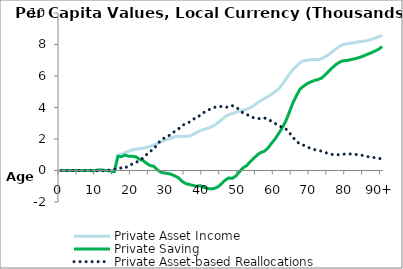
| Category | Private Asset Income | Private Saving | Private Asset-based Reallocations |
|---|---|---|---|
| 0 | 0 | -0.466 | 0.466 |
|  | 0 | -0.974 | 0.974 |
| 2 | 0 | -0.52 | 0.52 |
| 3 | 0 | -0.168 | 0.168 |
| 4 | 0 | 4.729 | -4.729 |
| 5 | 0 | -1.603 | 1.603 |
| 6 | 0 | -0.76 | 0.76 |
| 7 | 0 | -2.075 | 2.075 |
| 8 | 0 | -1.927 | 1.927 |
| 9 | 0 | -16.487 | 16.487 |
| 10 | 0 | 12.992 | -12.992 |
| 11 | 0 | 41.404 | -41.404 |
| 12 | 0 | 15.329 | -15.329 |
| 13 | 0 | -6.739 | 6.739 |
| 14 | 0 | -42.034 | 42.034 |
| 15 | 0 | -68.964 | 68.964 |
| 16 | 988.779 | 890.423 | 98.355 |
| 17 | 1050.04 | 875.482 | 174.558 |
| 18 | 1132.668 | 980.996 | 151.672 |
| 19 | 1223.722 | 902.758 | 320.963 |
| 20 | 1301.704 | 899.774 | 401.93 |
| 21 | 1354.694 | 869.34 | 485.354 |
| 22 | 1387.994 | 725.218 | 662.776 |
| 23 | 1418.592 | 637.777 | 780.815 |
| 24 | 1464.401 | 460.127 | 1004.273 |
| 25 | 1530.028 | 313.16 | 1216.868 |
| 26 | 1609.52 | 271.666 | 1337.854 |
| 27 | 1708.344 | 42.901 | 1665.444 |
| 28 | 1812.707 | -102.692 | 1915.399 |
| 29 | 1904.533 | -166.717 | 2071.25 |
| 30 | 1985.245 | -189.181 | 2174.426 |
| 31 | 2068.636 | -250.388 | 2319.024 |
| 32 | 2150.647 | -351.87 | 2502.516 |
| 33 | 2178.839 | -470.344 | 2649.183 |
| 34 | 2159.165 | -695.718 | 2854.883 |
| 35 | 2159.485 | -828.783 | 2988.268 |
| 36 | 2181.541 | -890.701 | 3072.242 |
| 37 | 2271.846 | -943.371 | 3215.217 |
| 38 | 2407.277 | -1008.691 | 3415.968 |
| 39 | 2522.315 | -962.302 | 3484.617 |
| 40 | 2603.318 | -1070.234 | 3673.552 |
| 41 | 2675.408 | -1128.928 | 3804.336 |
| 42 | 2748.172 | -1171.033 | 3919.205 |
| 43 | 2864.05 | -1137.329 | 4001.379 |
| 44 | 3033.531 | -1035.333 | 4068.864 |
| 45 | 3219.704 | -844.727 | 4064.431 |
| 46 | 3409.266 | -617.767 | 4027.034 |
| 47 | 3541.78 | -477.036 | 4018.816 |
| 48 | 3613.785 | -502.134 | 4115.919 |
| 49 | 3694.126 | -348.827 | 4042.954 |
| 50 | 3770.713 | -87.997 | 3858.71 |
| 51 | 3819.483 | 164.06 | 3655.423 |
| 52 | 3879.083 | 304.537 | 3574.546 |
| 53 | 3980.469 | 545.919 | 3434.549 |
| 54 | 4120.491 | 767.453 | 3353.038 |
| 55 | 4281.902 | 985.392 | 3296.509 |
| 56 | 4436.175 | 1139.853 | 3296.321 |
| 57 | 4556.551 | 1221.16 | 3335.391 |
| 58 | 4691.962 | 1421.278 | 3270.683 |
| 59 | 4845.127 | 1726.392 | 3118.735 |
| 60 | 4995.204 | 2004.018 | 2991.187 |
| 61 | 5183.077 | 2340.332 | 2842.745 |
| 62 | 5457.424 | 2709.381 | 2748.043 |
| 63 | 5781.277 | 3136.481 | 2644.796 |
| 64 | 6114.519 | 3704.515 | 2410.004 |
| 65 | 6405.237 | 4302.765 | 2102.472 |
| 66 | 6610.919 | 4754.351 | 1856.568 |
| 67 | 6847.473 | 5174.841 | 1672.632 |
| 68 | 6959.419 | 5355.026 | 1604.393 |
| 69 | 6996.148 | 5519.956 | 1476.192 |
| 70 | 7039.795 | 5624.897 | 1414.898 |
| 71 | 7044.332 | 5712.588 | 1331.744 |
| 72 | 7039.427 | 5772.352 | 1267.076 |
| 73 | 7098.348 | 5863.153 | 1235.195 |
| 74 | 7215.004 | 6064.241 | 1150.763 |
| 75 | 7366.846 | 6299.289 | 1067.557 |
| 76 | 7538.983 | 6518.582 | 1020.401 |
| 77 | 7714.378 | 6717.386 | 996.992 |
| 78 | 7877.168 | 6869.422 | 1007.746 |
| 79 | 7996.218 | 6965.722 | 1030.495 |
| 80 | 8040.92 | 6983.468 | 1057.453 |
| 81 | 8072.268 | 7023.265 | 1049.003 |
| 82 | 8109.547 | 7077.715 | 1031.831 |
| 83 | 8147.962 | 7135.632 | 1012.33 |
| 84 | 8190.757 | 7204.522 | 986.235 |
| 85 | 8214.029 | 7296.316 | 917.713 |
| 86 | 8265.789 | 7389.429 | 876.361 |
| 87 | 8327.207 | 7480.368 | 846.84 |
| 88 | 8402.746 | 7589.804 | 812.943 |
| 89 | 8485.818 | 7701.599 | 784.219 |
| 90+ | 8575.336 | 7865.813 | 709.523 |